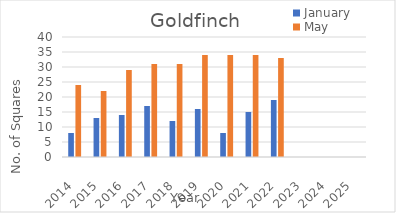
| Category | January | May |
|---|---|---|
| 2014.0 | 8 | 24 |
| 2015.0 | 13 | 22 |
| 2016.0 | 14 | 29 |
| 2017.0 | 17 | 31 |
| 2018.0 | 12 | 31 |
| 2019.0 | 16 | 34 |
| 2020.0 | 8 | 34 |
| 2021.0 | 15 | 34 |
| 2022.0 | 19 | 33 |
| 2023.0 | 0 | 0 |
| 2024.0 | 0 | 0 |
| 2025.0 | 0 | 0 |